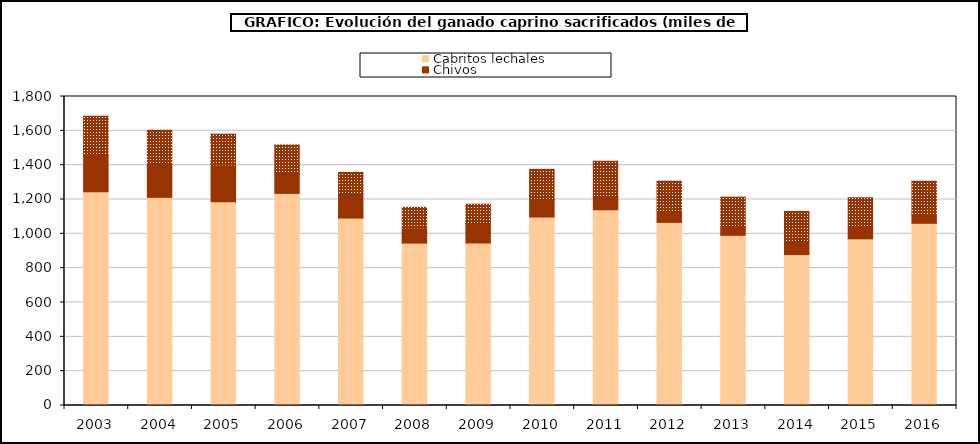
| Category | Cabritos lechales | Chivos | Mayor |
|---|---|---|---|
| 2003.0 | 1245.325 | 212.255 | 227.066 |
| 2004.0 | 1212.757 | 193.057 | 197.929 |
| 2005.0 | 1187.568 | 213.586 | 179.395 |
| 2006.0 | 1235.634 | 116.214 | 165.659 |
| 2007.0 | 1091.939 | 142.795 | 123.018 |
| 2008.0 | 946.005 | 88.612 | 119.891 |
| 2009.0 | 946.871 | 111.232 | 114.664 |
| 2010.0 | 1098.192 | 101.913 | 175.759 |
| 2011.0 | 1140.362 | 79.178 | 203.056 |
| 2012.0 | 1066.793 | 67.733 | 172.561 |
| 2013.0 | 991.445 | 48.941 | 173.365 |
| 2014.0 | 878.99 | 82.198 | 169.027 |
| 2015.0 | 971.043 | 66.091 | 173.135 |
| 2016.0 | 1061.299 | 51.43 | 193.715 |